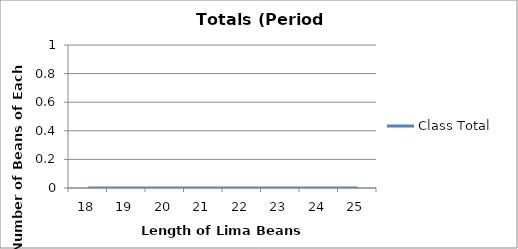
| Category | Class Total |
|---|---|
| 18.0 | 0 |
| 19.0 | 0 |
| 20.0 | 0 |
| 21.0 | 0 |
| 22.0 | 0 |
| 23.0 | 0 |
| 24.0 | 0 |
| 25.0 | 0 |